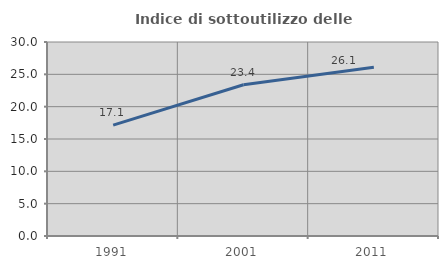
| Category | Indice di sottoutilizzo delle abitazioni  |
|---|---|
| 1991.0 | 17.139 |
| 2001.0 | 23.396 |
| 2011.0 | 26.098 |